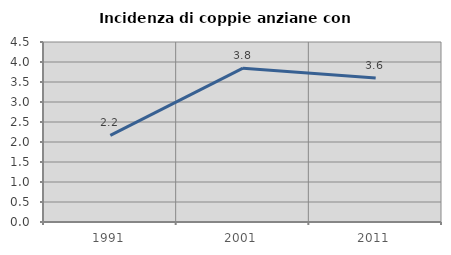
| Category | Incidenza di coppie anziane con figli |
|---|---|
| 1991.0 | 2.165 |
| 2001.0 | 3.846 |
| 2011.0 | 3.599 |